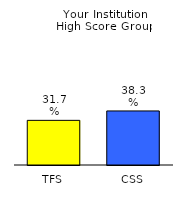
| Category | Series 0 |
|---|---|
| TFS | 0.317 |
| CSS | 0.383 |